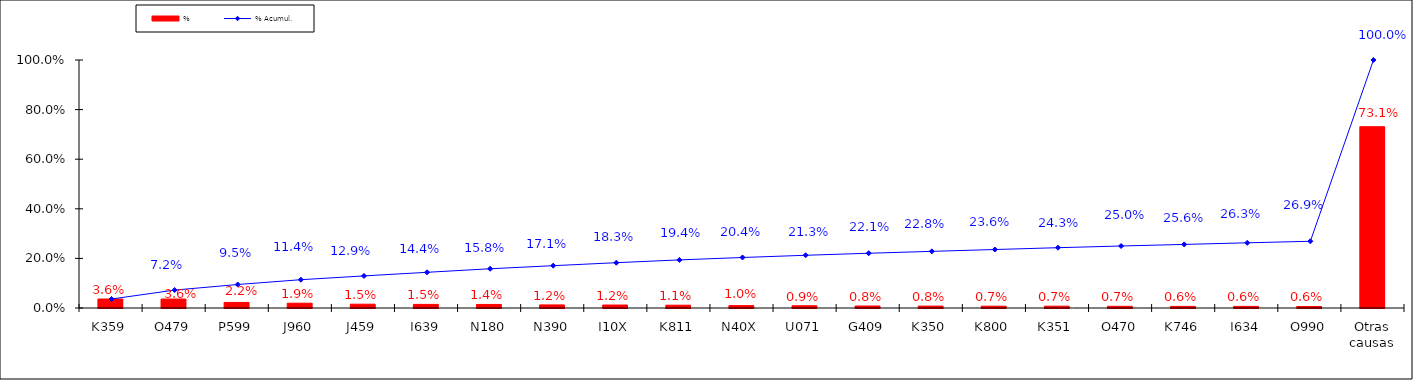
| Category | % |
|---|---|
| K359 | 0.036 |
| O479 | 0.036 |
| P599 | 0.022 |
| J960 | 0.019 |
| J459 | 0.015 |
| I639 | 0.015 |
| N180 | 0.014 |
| N390 | 0.012 |
| I10X | 0.012 |
| K811 | 0.011 |
| N40X | 0.01 |
| U071 | 0.009 |
| G409 | 0.008 |
| K350 | 0.008 |
| K800 | 0.007 |
| K351 | 0.007 |
| O470 | 0.007 |
| K746 | 0.006 |
| I634 | 0.006 |
| O990 | 0.006 |
| Otras causas | 0.731 |